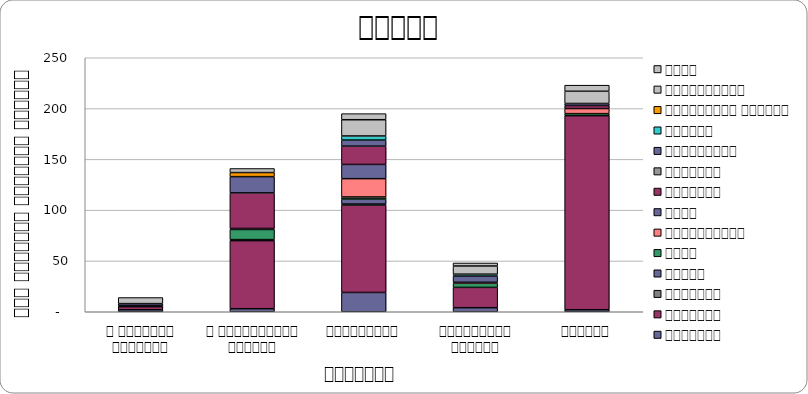
| Category | सुरक्षा | राजनीति | आन्दोलन | न्याय | शासन | अर्थतन्त्र | समाज | कुटनीति | वातावरण | स्वास्थ्य  | शिक्षा | प्राकृतिक प्रकोप | भ्रष्टाचार | अन्य |
|---|---|---|---|---|---|---|---|---|---|---|---|---|---|---|
| द हिमालयन टाइम्स् | 2 | 3 | 0 | 0 | 1 | 0 | 0 | 0 | 0 | 2 | 0 | 0 | 0 | 6 |
| द काठमाण्डौं पोस्ट् | 3 | 67 | 0 | 1 | 10 | 0 | 1 | 35 | 0 | 16 | 0 | 4 | 4 | 0 |
| कान्तिपुर | 19 | 86 | 1 | 5 | 2 | 18 | 14 | 18 | 0 | 6 | 4 | 0 | 16 | 6 |
| अन्नपूर्ण पोस्ट् | 4 | 20 | 0 | 0 | 4 | 1 | 6 | 0 | 0 | 1 | 1 | 0 | 8 | 3 |
| नागरिक | 2 | 191 | 0 | 0 | 2 | 5 | 0 | 3 | 0 | 2 | 0 | 0 | 12 | 6 |